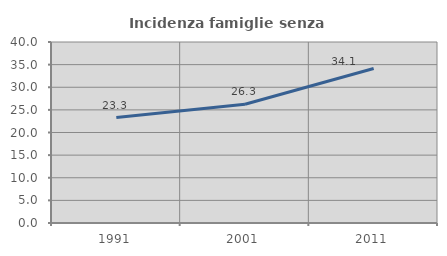
| Category | Incidenza famiglie senza nuclei |
|---|---|
| 1991.0 | 23.306 |
| 2001.0 | 26.256 |
| 2011.0 | 34.141 |